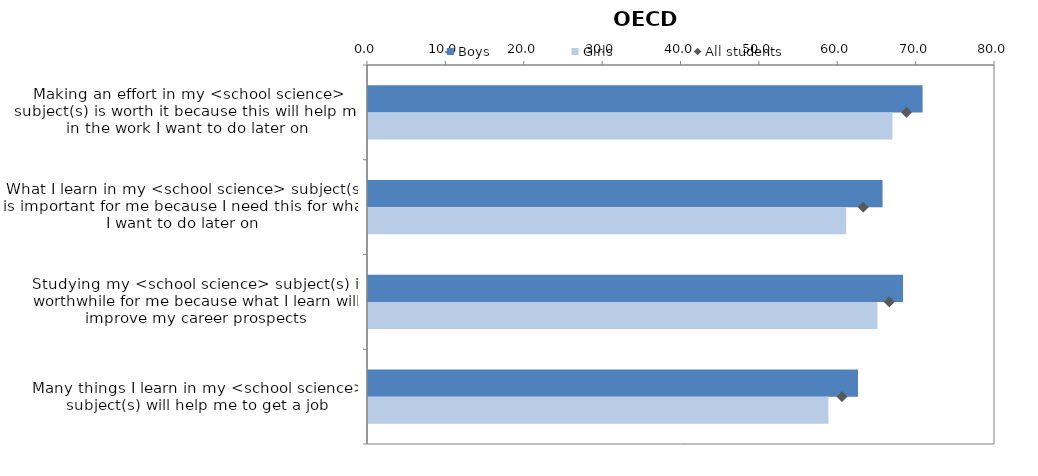
| Category | Boys | Girls |
|---|---|---|
| Making an effort in my <school science> subject(s) is worth it because this will help me in the work I want to do later on | 70.762 | 66.915 |
| What I learn in my <school science> subject(s) is important for me because I need this for what I want to do later on | 65.655 | 61.015 |
| Studying my <school science> subject(s) is worthwhile for me because what I learn will improve my career prospects | 68.264 | 64.996 |
| Many things I learn in my <school science> subject(s) will help me to get a job | 62.519 | 58.743 |